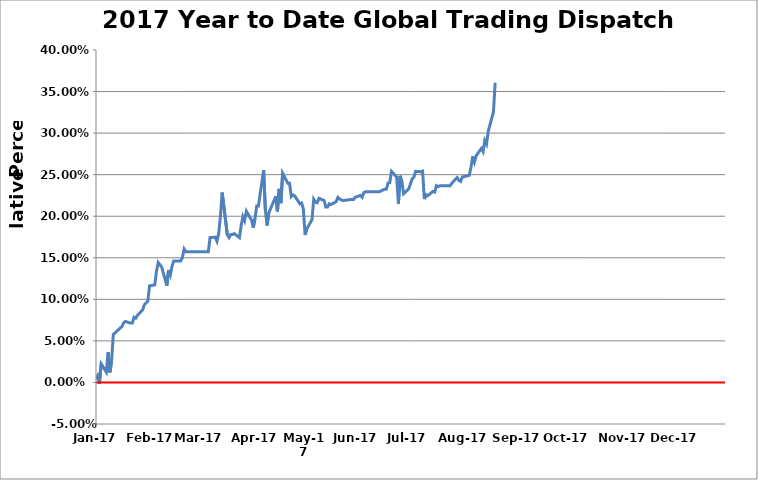
| Category | 2017 Year to Date Global Trading Dispatch Performance  |
|---|---|
| 2017-01-03 | 0.004 |
| 2017-01-04 | 0.008 |
| 2017-01-05 | -0.002 |
| 2017-01-06 | 0.022 |
| 2017-01-09 | 0.012 |
| 2017-01-10 | 0.036 |
| 2017-01-11 | 0.012 |
| 2017-01-12 | 0.025 |
| 2017-01-13 | 0.058 |
| 2017-01-18 | 0.067 |
| 2017-01-19 | 0.072 |
| 2017-01-20 | 0.073 |
| 2017-01-23 | 0.071 |
| 2017-01-24 | 0.071 |
| 2017-01-25 | 0.078 |
| 2017-01-26 | 0.077 |
| 2017-01-27 | 0.081 |
| 2017-01-30 | 0.087 |
| 2017-01-31 | 0.094 |
| 2017-02-01 | 0.096 |
| 2017-02-02 | 0.098 |
| 2017-02-03 | 0.116 |
| 2017-02-06 | 0.117 |
| 2017-02-07 | 0.134 |
| 2017-02-08 | 0.144 |
| 2017-02-10 | 0.139 |
| 2017-02-13 | 0.116 |
| 2017-02-14 | 0.135 |
| 2017-02-15 | 0.129 |
| 2017-02-16 | 0.14 |
| 2017-02-17 | 0.146 |
| 2017-02-21 | 0.146 |
| 2017-02-22 | 0.15 |
| 2017-02-23 | 0.161 |
| 2017-02-24 | 0.157 |
| 2017-02-27 | 0.157 |
| 2017-02-28 | 0.157 |
| 2017-03-01 | 0.157 |
| 2017-03-02 | 0.157 |
| 2017-03-03 | 0.157 |
| 2017-03-06 | 0.157 |
| 2017-03-07 | 0.157 |
| 2017-03-08 | 0.157 |
| 2017-03-09 | 0.157 |
| 2017-03-10 | 0.174 |
| 2017-03-13 | 0.175 |
| 2017-03-14 | 0.17 |
| 2017-03-15 | 0.179 |
| 2017-03-16 | 0.2 |
| 2017-03-17 | 0.228 |
| 2017-03-20 | 0.178 |
| 2017-03-21 | 0.174 |
| 2017-03-22 | 0.178 |
| 2017-03-23 | 0.178 |
| 2017-03-24 | 0.179 |
| 2017-03-27 | 0.174 |
| 2017-03-28 | 0.189 |
| 2017-03-29 | 0.2 |
| 2017-03-30 | 0.195 |
| 2017-03-31 | 0.206 |
| 2017-04-03 | 0.195 |
| 2017-04-04 | 0.186 |
| 2017-04-05 | 0.197 |
| 2017-04-06 | 0.212 |
| 2017-04-07 | 0.212 |
| 2017-04-10 | 0.256 |
| 2017-04-11 | 0.208 |
| 2017-04-12 | 0.189 |
| 2017-04-13 | 0.204 |
| 2017-04-17 | 0.224 |
| 2017-04-18 | 0.206 |
| 2017-04-19 | 0.233 |
| 2017-04-20 | 0.216 |
| 2017-04-21 | 0.252 |
| 2017-04-24 | 0.24 |
| 2017-04-25 | 0.24 |
| 2017-04-26 | 0.224 |
| 2017-04-27 | 0.226 |
| 2017-04-28 | 0.224 |
| 2017-05-01 | 0.215 |
| 2017-05-02 | 0.216 |
| 2017-05-03 | 0.209 |
| 2017-05-04 | 0.178 |
| 2017-05-05 | 0.185 |
| 2017-05-08 | 0.196 |
| 2017-05-09 | 0.22 |
| 2017-05-10 | 0.217 |
| 2017-05-11 | 0.216 |
| 2017-05-12 | 0.222 |
| 2017-05-15 | 0.219 |
| 2017-05-16 | 0.211 |
| 2017-05-17 | 0.211 |
| 2017-05-18 | 0.215 |
| 2017-05-19 | 0.214 |
| 2017-05-22 | 0.218 |
| 2017-05-23 | 0.223 |
| 2017-05-24 | 0.221 |
| 2017-05-25 | 0.22 |
| 2017-05-26 | 0.219 |
| 2017-05-30 | 0.22 |
| 2017-05-31 | 0.22 |
| 2017-06-01 | 0.22 |
| 2017-06-02 | 0.223 |
| 2017-06-05 | 0.225 |
| 2017-06-06 | 0.223 |
| 2017-06-07 | 0.228 |
| 2017-06-08 | 0.23 |
| 2017-06-09 | 0.23 |
| 2017-06-12 | 0.23 |
| 2017-06-13 | 0.23 |
| 2017-06-14 | 0.23 |
| 2017-06-15 | 0.23 |
| 2017-06-16 | 0.23 |
| 2017-06-19 | 0.232 |
| 2017-06-20 | 0.232 |
| 2017-06-21 | 0.24 |
| 2017-06-22 | 0.24 |
| 2017-06-23 | 0.254 |
| 2017-06-26 | 0.247 |
| 2017-06-27 | 0.215 |
| 2017-06-28 | 0.249 |
| 2017-06-29 | 0.242 |
| 2017-06-30 | 0.227 |
| 2017-07-03 | 0.233 |
| 2017-07-05 | 0.245 |
| 2017-07-06 | 0.247 |
| 2017-07-07 | 0.254 |
| 2017-07-10 | 0.254 |
| 2017-07-11 | 0.254 |
| 2017-07-12 | 0.221 |
| 2017-07-13 | 0.226 |
| 2017-07-14 | 0.225 |
| 2017-07-17 | 0.23 |
| 2017-07-18 | 0.229 |
| 2017-07-19 | 0.237 |
| 2017-07-20 | 0.236 |
| 2017-07-21 | 0.237 |
| 2017-07-24 | 0.237 |
| 2017-07-25 | 0.237 |
| 2017-07-26 | 0.237 |
| 2017-07-27 | 0.237 |
| 2017-07-28 | 0.24 |
| 2017-07-31 | 0.246 |
| 2017-08-01 | 0.243 |
| 2017-08-02 | 0.242 |
| 2017-08-03 | 0.247 |
| 2017-08-04 | 0.248 |
| 2017-08-07 | 0.249 |
| 2017-08-08 | 0.259 |
| 2017-08-09 | 0.272 |
| 2017-08-10 | 0.265 |
| 2017-08-11 | 0.273 |
| 2017-08-14 | 0.282 |
| 2017-08-15 | 0.278 |
| 2017-08-16 | 0.291 |
| 2017-08-17 | 0.287 |
| 2017-08-18 | 0.302 |
| 2017-08-21 | 0.325 |
| 2017-08-22 | 0.36 |